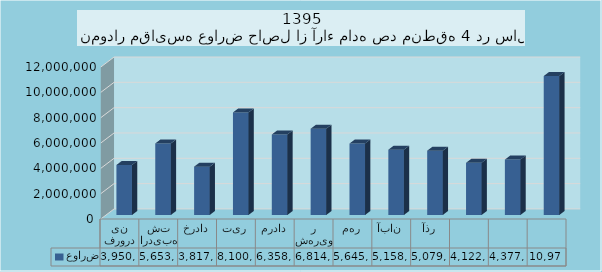
| Category | عوارض |
|---|---|
| فروردین | 3950296 |
| اردیبهشت | 5653637 |
| خرداد | 3817700 |
| تیر | 8100749 |
| مرداد | 6358109 |
| شهریور | 6814973 |
| مهر | 5645716 |
| آبان | 5158447 |
| آذر | 5079230 |